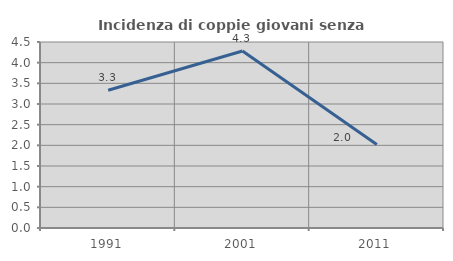
| Category | Incidenza di coppie giovani senza figli |
|---|---|
| 1991.0 | 3.333 |
| 2001.0 | 4.283 |
| 2011.0 | 2.02 |